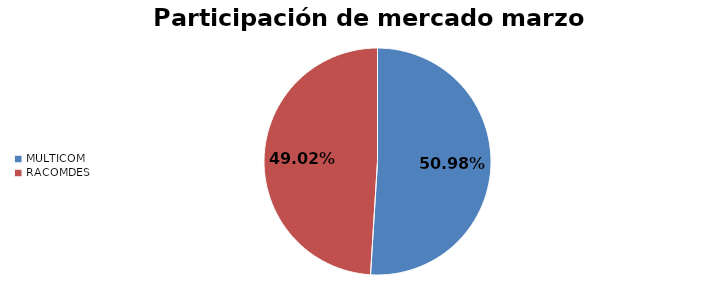
| Category | Series 0 |
|---|---|
| MULTICOM | 0.51 |
| RACOMDES | 0.49 |